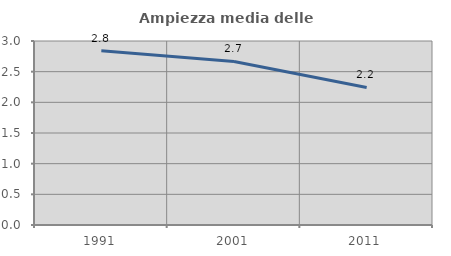
| Category | Ampiezza media delle famiglie |
|---|---|
| 1991.0 | 2.841 |
| 2001.0 | 2.667 |
| 2011.0 | 2.243 |